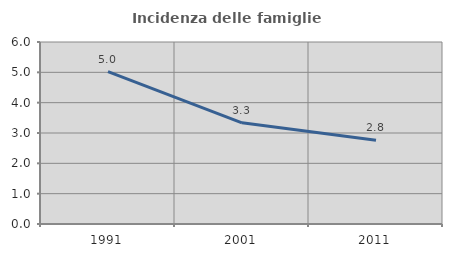
| Category | Incidenza delle famiglie numerose |
|---|---|
| 1991.0 | 5.021 |
| 2001.0 | 3.336 |
| 2011.0 | 2.758 |